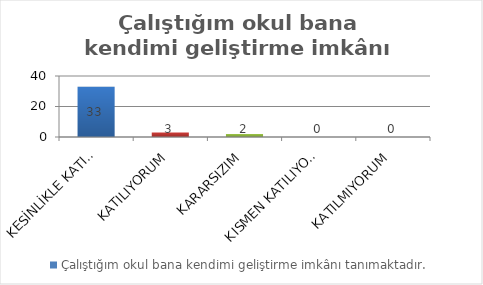
| Category | Çalıştığım okul bana kendimi geliştirme imkânı tanımaktadır. |
|---|---|
| KESİNLİKLE KATILIYORUM | 33 |
| KATILIYORUM | 3 |
| KARARSIZIM | 2 |
| KISMEN KATILIYORUM | 0 |
| KATILMIYORUM | 0 |